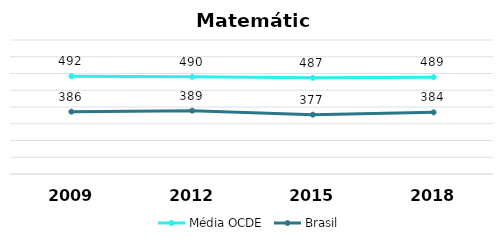
| Category | Média OCDE | Brasil |
|---|---|---|
| 2009.0 | 492 | 386 |
| 2012.0 | 490 | 389 |
| 2015.0 | 487 | 377 |
| 2018.0 | 489 | 384 |